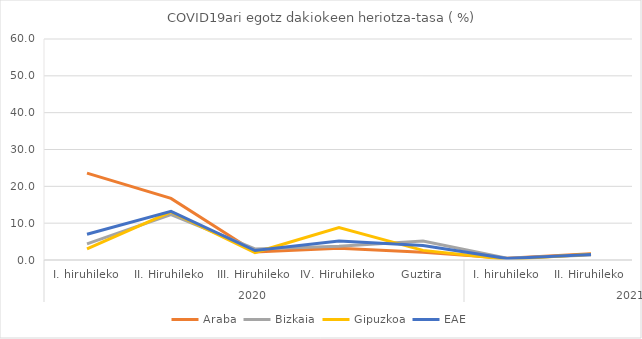
| Category | Araba | Bizkaia | Gipuzkoa | EAE |
|---|---|---|---|---|
| 0 | 23.577 | 4.374 | 3.022 | 6.979 |
| 1 | 16.724 | 12.298 | 13.072 | 13.228 |
| 2 | 2.195 | 2.987 | 2.02 | 2.57 |
| 3 | 3.199 | 3.721 | 8.806 | 5.144 |
| 4 | 2.076 | 5.165 | 2.614 | 3.914 |
| 5 | 0.474 | 0.472 | 0.175 | 0.385 |
| 6 | 1.67 | 1.336 | 1.586 | 1.463 |